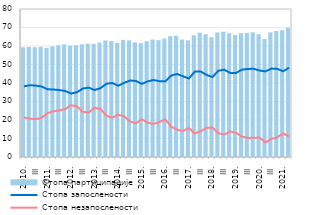
| Category | Стопа партиципације  |
|---|---|
| 2010. | 59.3 |
| II | 59.5 |
| III | 59.3 |
| IV | 59.5 |
| 2011. | 58.9 |
| II | 59.8 |
| III | 60.4 |
| IV | 60.9 |
| 2012. | 60.2 |
| II | 60.4 |
| III | 60.9 |
| IV | 61.2 |
| 2013. | 61.2 |
| II | 61.9 |
| III | 63 |
| IV | 62.7 |
| 2014. | 61.618 |
| II | 63.339 |
| III | 63.021 |
| IV | 61.968 |
| 2015. | 61.562 |
| II | 62.578 |
| III | 63.461 |
| IV | 63.162 |
| 2016. | 64.03 |
| II | 65.299 |
| III | 65.502 |
| IV | 63.48 |
| 2017. | 62.988 |
| II | 65.783 |
| III | 67.173 |
| IV | 66.346 |
| 2018. | 64.703 |
| II | 67.308 |
| III | 67.721 |
| IV | 66.898 |
| 2019. | 65.968 |
| II | 66.941 |
| III | 67.038 |
| IV | 67.376 |
| 2020. | 66.327 |
| II | 63.79 |
| III | 67.371 |
| IV | 68.129 |
| 2021. | 68.532 |
| II | 69.8 |